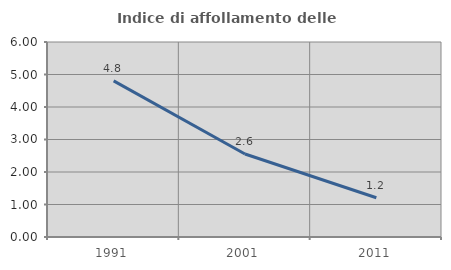
| Category | Indice di affollamento delle abitazioni  |
|---|---|
| 1991.0 | 4.803 |
| 2001.0 | 2.554 |
| 2011.0 | 1.208 |